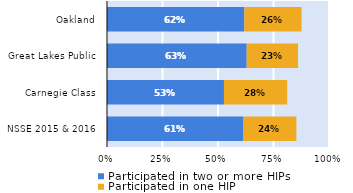
| Category | Participated in two or more HIPs | Participated in one HIP |
|---|---|---|
| NSSE 2015 & 2016 | 0.613 | 0.241 |
| Carnegie Class | 0.527 | 0.285 |
| Great Lakes Public | 0.629 | 0.231 |
| Oakland | 0.619 | 0.258 |